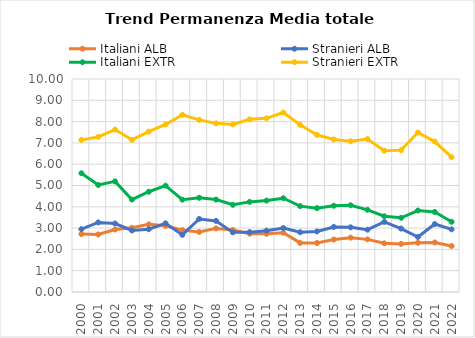
| Category | Italiani ALB | Stranieri ALB | Italiani EXTR | Stranieri EXTR |
|---|---|---|---|---|
| 2000.0 | 2.72 | 2.949 | 5.574 | 7.14 |
| 2001.0 | 2.701 | 3.267 | 5.024 | 7.283 |
| 2002.0 | 2.934 | 3.216 | 5.193 | 7.626 |
| 2003.0 | 3.013 | 2.887 | 4.338 | 7.144 |
| 2004.0 | 3.175 | 2.947 | 4.707 | 7.531 |
| 2005.0 | 3.11 | 3.225 | 4.993 | 7.866 |
| 2006.0 | 2.905 | 2.682 | 4.335 | 8.317 |
| 2007.0 | 2.82 | 3.429 | 4.424 | 8.081 |
| 2008.0 | 2.986 | 3.337 | 4.339 | 7.918 |
| 2009.0 | 2.915 | 2.8 | 4.094 | 7.866 |
| 2010.0 | 2.74 | 2.809 | 4.231 | 8.107 |
| 2011.0 | 2.729 | 2.878 | 4.292 | 8.152 |
| 2012.0 | 2.782 | 3.002 | 4.405 | 8.426 |
| 2013.0 | 2.305 | 2.806 | 4.03 | 7.848 |
| 2014.0 | 2.3 | 2.843 | 3.938 | 7.374 |
| 2015.0 | 2.464 | 3.055 | 4.048 | 7.163 |
| 2016.0 | 2.552 | 3.036 | 4.072 | 7.076 |
| 2017.0 | 2.471 | 2.925 | 3.859 | 7.179 |
| 2018.0 | 2.285 | 3.29 | 3.557 | 6.637 |
| 2019.0 | 2.258 | 2.976 | 3.483 | 6.661 |
| 2020.0 | 2.309 | 2.583 | 3.824 | 7.487 |
| 2021.0 | 2.326 | 3.192 | 3.758 | 7.063 |
| 2022.0 | 2.16 | 2.942 | 3.297 | 6.328 |